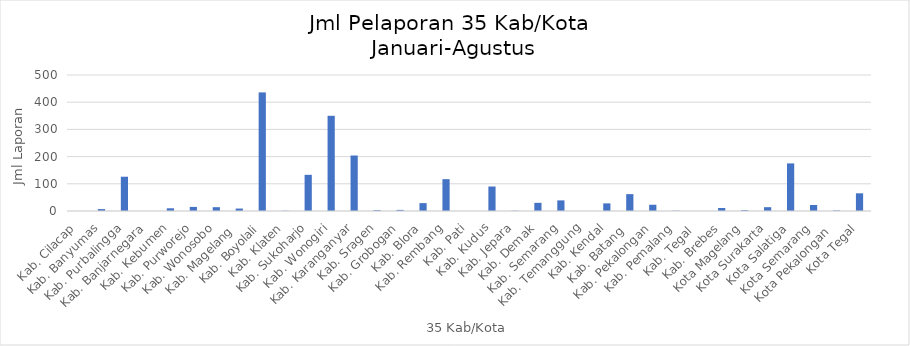
| Category | Series 0 |
|---|---|
| Kab. Cilacap | 0 |
| Kab. Banyumas | 7 |
| Kab. Purbalingga | 126 |
| Kab. Banjarnegara | 0 |
| Kab. Kebumen | 10 |
| Kab. Purworejo | 15 |
| Kab. Wonosobo | 14 |
| Kab. Magelang  | 9 |
| Kab. Boyolali | 436 |
| Kab. Klaten | 1 |
| Kab. Sukoharjo | 133 |
| Kab. Wonogiri | 350 |
| Kab. Karanganyar | 204 |
| Kab. Sragen | 3 |
| Kab. Grobogan | 4 |
| Kab. Blora | 29 |
| Kab. Rembang | 117 |
| Kab. Pati | 0 |
| Kab. Kudus | 90 |
| Kab. Jepara | 1 |
| Kab. Demak | 30 |
| Kab. Semarang | 39 |
| Kab. Temanggung | 0 |
| Kab. Kendal | 28 |
| Kab. Batang  | 62 |
| Kab. Pekalongan | 23 |
| Kab. Pemalang | 1 |
| Kab. Tegal  | 0 |
| Kab. Brebes | 11 |
| Kota Magelang | 3 |
| Kota Surakarta | 14 |
| Kota Salatiga | 175 |
| Kota Semarang | 22 |
| Kota Pekalongan  | 2 |
| Kota Tegal | 65 |